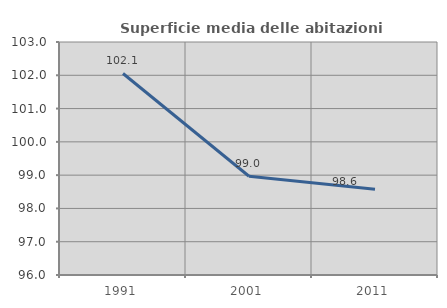
| Category | Superficie media delle abitazioni occupate |
|---|---|
| 1991.0 | 102.054 |
| 2001.0 | 98.967 |
| 2011.0 | 98.576 |